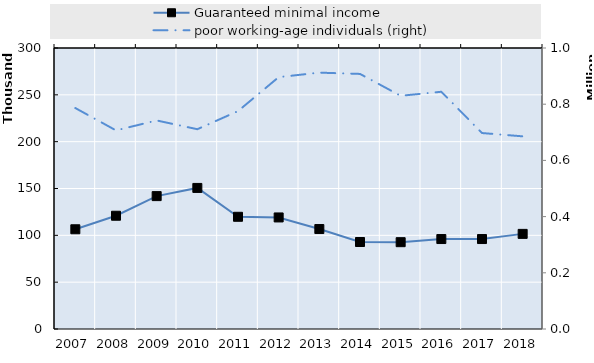
| Category | Guaranteed minimal income | Series 4 | Series 5 | Series 6 | Series 7 | Series 8 | Series 9 | Series 10 | Series 11 | Series 12 | Series 13 | Series 14 | Series 15 | Series 16 | Series 17 | Series 18 | Series 19 |
|---|---|---|---|---|---|---|---|---|---|---|---|---|---|---|---|---|---|
| 2007.0 | 106472.083 |  |  |  |  |  |  |  |  |  |  |  |  |  |  |  |  |
| 2008.0 | 120921.083 |  |  |  |  |  |  |  |  |  |  |  |  |  |  |  |  |
| 2009.0 | 141873.75 |  |  |  |  |  |  |  |  |  |  |  |  |  |  |  |  |
| 2010.0 | 150605.167 |  |  |  |  |  |  |  |  |  |  |  |  |  |  |  |  |
| 2011.0 | 119805.917 |  |  |  |  |  |  |  |  |  |  |  |  |  |  |  |  |
| 2012.0 | 119092.75 |  |  |  |  |  |  |  |  |  |  |  |  |  |  |  |  |
| 2013.0 | 106726.667 |  |  |  |  |  |  |  |  |  |  |  |  |  |  |  |  |
| 2014.0 | 92868.667 |  |  |  |  |  |  |  |  |  |  |  |  |  |  |  |  |
| 2015.0 | 92685.833 |  |  |  |  |  |  |  |  |  |  |  |  |  |  |  |  |
| 2016.0 | 96039.917 |  |  |  |  |  |  |  |  |  |  |  |  |  |  |  |  |
| 2017.0 | 96040 |  |  |  |  |  |  |  |  |  |  |  |  |  |  |  |  |
| 2018.0 | 101551 |  |  |  |  |  |  |  |  |  |  |  |  |  |  |  |  |